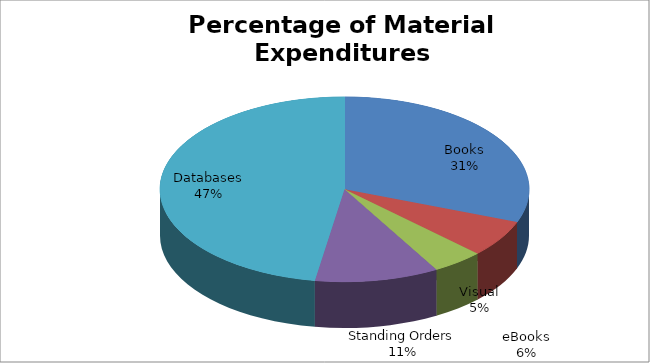
| Category | Series 0 |
|---|---|
| Books | 81011.46 |
| eBooks | 16922.76 |
| Visual | 11852 |
| Standing Orders | 28553.99 |
| Databases | 124855.65 |